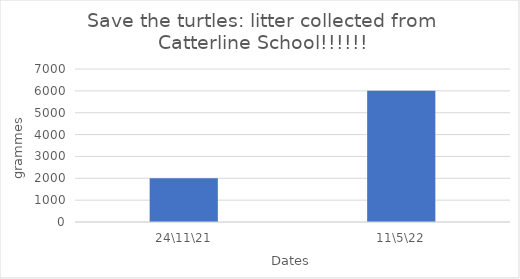
| Category | Series 0 |
|---|---|
| 24\11\21 | 2000 |
| 11\5\22 | 6000 |